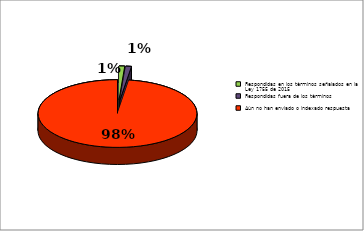
| Category | Series 0 |
|---|---|
| Respondidas en los tèrminos señalados en la Ley 1755 de 2015 | 0.012 |
| Respondidas fuera de los tèrminos | 0.012 |
| Aùn no han enviado o indexado respuesta | 0.977 |